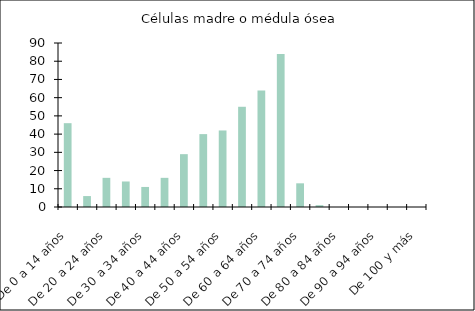
| Category | Células madre o médula ósea |
|---|---|
| De 0 a 14 años | 46 |
| De 15 a 19 años | 6 |
| De 20 a 24 años | 16 |
| De 25 a 29 años | 14 |
| De 30 a 34 años | 11 |
| De 35 a 39 años | 16 |
| De 40 a 44 años | 29 |
| De 45 a 49 años | 40 |
| De 50 a 54 años | 42 |
| De 55 a 59 años | 55 |
| De 60 a 64 años | 64 |
| De 65 a 69 años | 84 |
| De 70 a 74 años | 13 |
| De 75 a 79 años | 1 |
| De 80 a 84 años | 0 |
| De 85 a 89 años | 0 |
| De 90 a 94 años | 0 |
| De 95 a 99 años | 0 |
| De 100 y más | 0 |